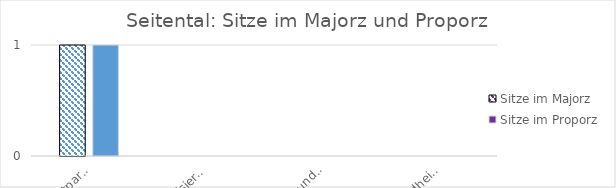
| Category | Sitze im Majorz | Sitze im Proporz |
|---|---|---|
| Umweltpartei | 1 | 1 |
| Digitalisierungspartei | 0 | 0 |
| Sport- und Kulturpartei | 0 | 0 |
| Gesundheitspartei | 0 | 0 |